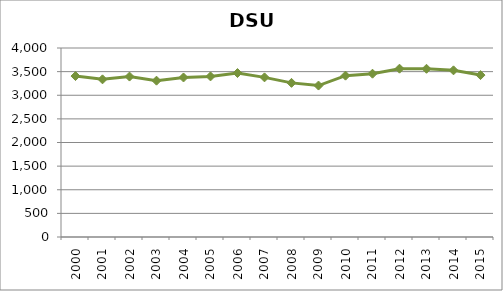
| Category | Series 0 |
|---|---|
| 2000.0 | 3406.242 |
| 2001.0 | 3336.7 |
| 2002.0 | 3395.367 |
| 2003.0 | 3308.45 |
| 2004.0 | 3375.958 |
| 2005.0 | 3398.8 |
| 2006.0 | 3470.108 |
| 2007.0 | 3378.633 |
| 2008.0 | 3261.975 |
| 2009.0 | 3205.108 |
| 2010.0 | 3414.367 |
| 2011.0 | 3455.925 |
| 2012.0 | 3562.233 |
| 2013.0 | 3560.35 |
| 2014.0 | 3527.3 |
| 2015.0 | 3426.667 |